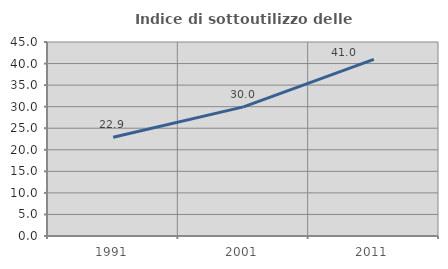
| Category | Indice di sottoutilizzo delle abitazioni  |
|---|---|
| 1991.0 | 22.887 |
| 2001.0 | 29.96 |
| 2011.0 | 40.972 |